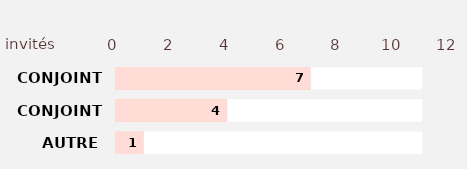
| Category | Series 2 | Series 3 | Series 1 | Series 0 |
|---|---|---|---|---|
| AUTRE | 11 | 1 | 11 | 1 |
| CONJOINT 2 | 11 | 4 | 11 | 4 |
| CONJOINT 1 | 11 | 7 | 11 | 7 |